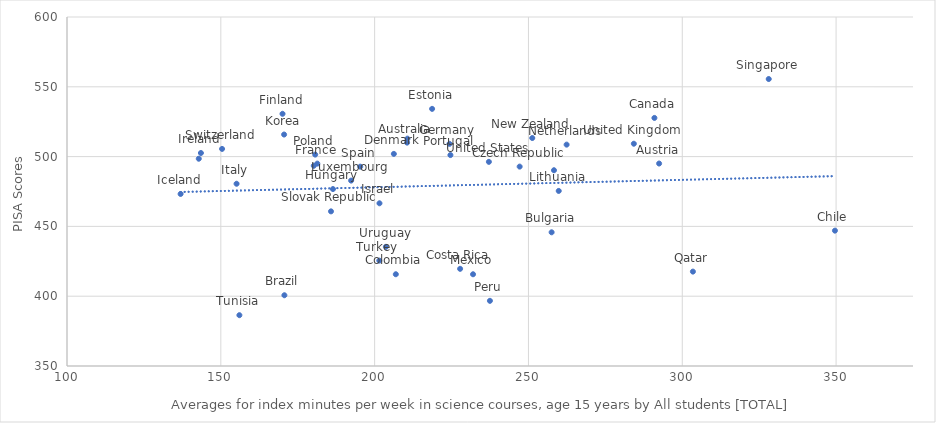
| Category | Series 0 |
|---|---|
| 210.545711827166 | 509.994 |
| 292.471347542304 | 495.037 |
| 170.667543226354 | 400.682 |
| 257.533516922205 | 445.772 |
| 290.944460494662 | 527.705 |
| 349.625940150624 | 446.956 |
| 206.884489739776 | 415.729 |
| 227.786421457437 | 419.608 |
| 247.141276906455 | 492.83 |
| 206.244441799309 | 501.937 |
| 218.680726426649 | 534.194 |
| 170.056892166741 | 530.661 |
| 181.365923496175 | 494.978 |
| 224.323116631205 | 509.141 |
| 186.451328849067 | 476.748 |
| 136.927845794063 | 473.23 |
| 143.527988472201 | 502.575 |
| 201.57313117071 | 466.553 |
| 155.118352691436 | 480.547 |
| 170.569538179651 | 515.81 |
| 258.294974002045 | 490.225 |
| 259.840990493139 | 475.409 |
| 192.354433249739 | 482.806 |
| 231.988555203075 | 415.71 |
| 262.406486635378 | 508.575 |
| 251.239931023911 | 513.304 |
| 142.835244504346 | 498.481 |
| 237.475159716642 | 396.684 |
| 180.682877957169 | 501.435 |
| 224.635379158172 | 501.1 |
| 303.45853997681 | 417.611 |
| 328.10162440868 | 555.575 |
| 185.816727700127 | 460.775 |
| 210.660563495916 | 512.864 |
| 195.321568357972 | 492.786 |
| 180.222216591178 | 493.422 |
| 150.407459418625 | 505.506 |
| 156.035336556656 | 386.403 |
| 201.523340191586 | 425.49 |
| 284.258598204864 | 509.222 |
| 237.136582741559 | 496.242 |
| 203.660621267363 | 435.363 |